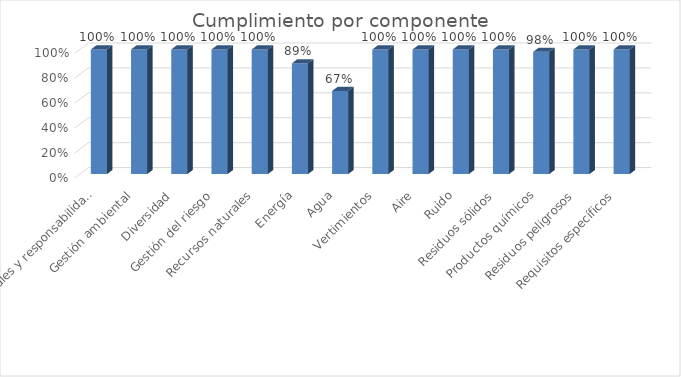
| Category | Series 0 |
|---|---|
| Principios generales y responsabilidades | 1 |
| Gestión ambiental | 1 |
| Diversidad | 1 |
| Gestión del riesgo | 1 |
| Recursos naturales | 1 |
| Energía | 0.889 |
| Agua | 0.667 |
| Vertimientos | 1 |
| Aire | 1 |
| Ruido | 1 |
| Residuos sólidos | 1 |
| Productos químicos | 0.981 |
| Residuos peligrosos | 1 |
| Requisitos específicos | 1 |